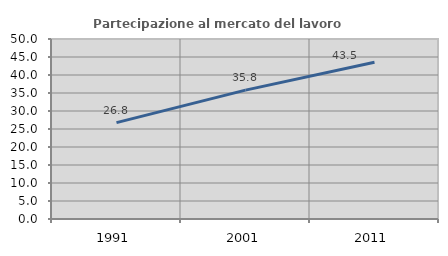
| Category | Partecipazione al mercato del lavoro  femminile |
|---|---|
| 1991.0 | 26.761 |
| 2001.0 | 35.792 |
| 2011.0 | 43.548 |